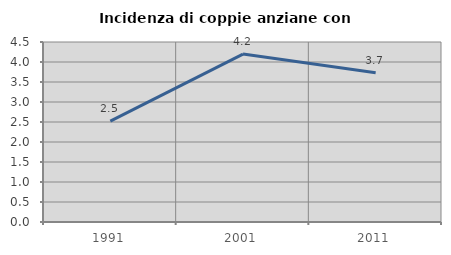
| Category | Incidenza di coppie anziane con figli |
|---|---|
| 1991.0 | 2.521 |
| 2001.0 | 4.198 |
| 2011.0 | 3.731 |